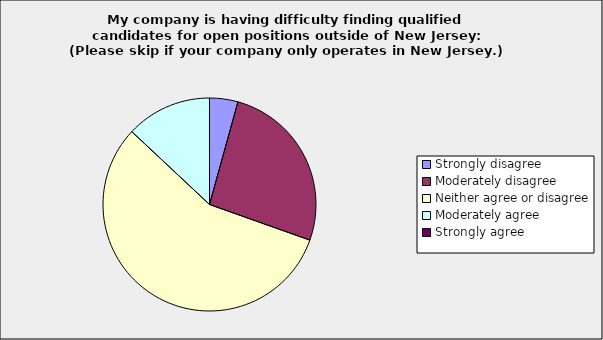
| Category | Series 0 |
|---|---|
| Strongly disagree | 0.043 |
| Moderately disagree | 0.261 |
| Neither agree or disagree | 0.565 |
| Moderately agree | 0.13 |
| Strongly agree | 0 |